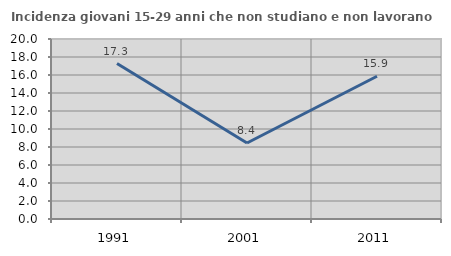
| Category | Incidenza giovani 15-29 anni che non studiano e non lavorano  |
|---|---|
| 1991.0 | 17.273 |
| 2001.0 | 8.442 |
| 2011.0 | 15.862 |